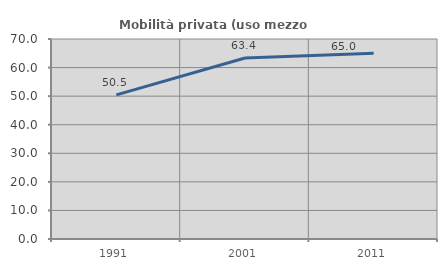
| Category | Mobilità privata (uso mezzo privato) |
|---|---|
| 1991.0 | 50.461 |
| 2001.0 | 63.358 |
| 2011.0 | 65.01 |